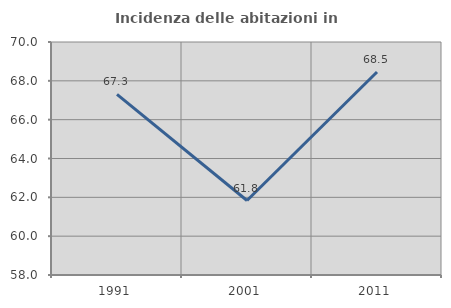
| Category | Incidenza delle abitazioni in proprietà  |
|---|---|
| 1991.0 | 67.3 |
| 2001.0 | 61.836 |
| 2011.0 | 68.456 |